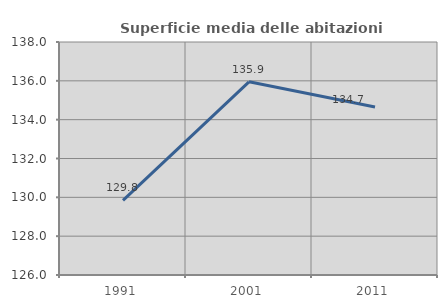
| Category | Superficie media delle abitazioni occupate |
|---|---|
| 1991.0 | 129.843 |
| 2001.0 | 135.95 |
| 2011.0 | 134.652 |